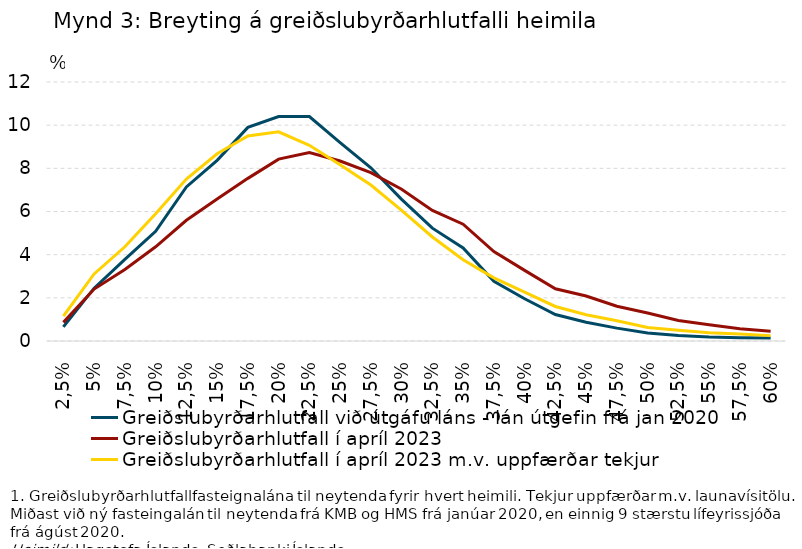
| Category | Greiðslubyrðarhlutfall við útgáfu láns - lán útgefin frá jan 2020 | Greiðslubyrðarhlutfall í apríl 2023 | Greiðslubyrðarhlutfall í apríl 2023 m.v. uppfærðar tekjur |
|---|---|---|---|
| 2,5% | 0.653 | 0.862 | 1.149 |
| 5% | 2.448 | 2.405 | 3.105 |
| 7,5% | 3.78 | 3.317 | 4.366 |
| 10% | 5.083 | 4.366 | 5.894 |
| 12,5% | 7.14 | 5.593 | 7.503 |
| 15% | 8.369 | 6.578 | 8.676 |
| 17,5% | 9.898 | 7.536 | 9.497 |
| 20% | 10.399 | 8.425 | 9.695 |
| 22,5% | 10.399 | 8.729 | 9.069 |
| 25% | 9.194 | 8.339 | 8.171 |
| 27,5% | 8.025 | 7.799 | 7.224 |
| 30% | 6.561 | 7.034 | 6.056 |
| 32,5% | 5.229 | 6.047 | 4.819 |
| 35% | 4.312 | 5.412 | 3.765 |
| 37,5% | 2.763 | 4.146 | 2.923 |
| 40% | 1.956 | 3.272 | 2.262 |
| 42,5% | 1.225 | 2.421 | 1.6 |
| 45% | 0.872 | 2.083 | 1.216 |
| 47,5% | 0.597 | 1.613 | 0.936 |
| 50% | 0.373 | 1.296 | 0.624 |
| 52,5% | 0.259 | 0.948 | 0.498 |
| 55% | 0.181 | 0.758 | 0.384 |
| 57,5% | 0.148 | 0.563 | 0.321 |
| 60% | 0.136 | 0.456 | 0.249 |